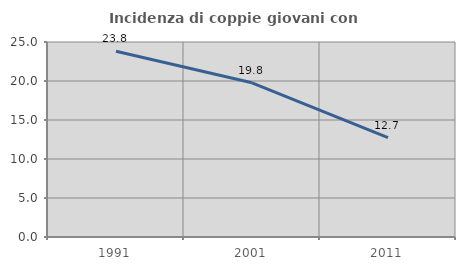
| Category | Incidenza di coppie giovani con figli |
|---|---|
| 1991.0 | 23.804 |
| 2001.0 | 19.768 |
| 2011.0 | 12.731 |